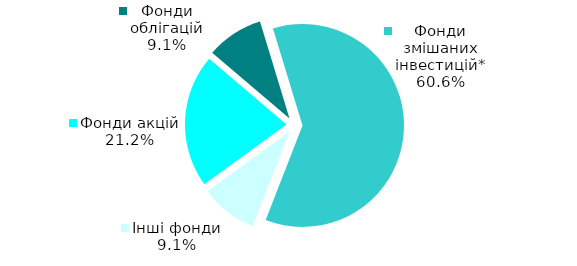
| Category | Series 0 |
|---|---|
| Фонди акцій | 7 |
| Фонди облігацій | 3 |
| Фонди змішаних інвестицій* | 20 |
| Інші фонди | 3 |